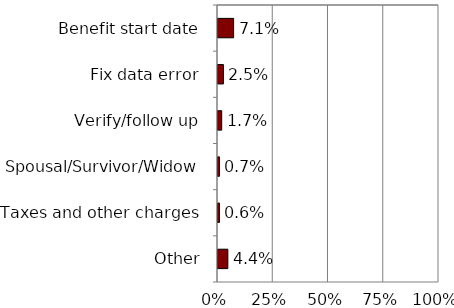
| Category | Series 0 |
|---|---|
| Benefit start date | 0.071 |
| Fix data error | 0.025 |
| Verify/follow up | 0.017 |
| Spousal/Survivor/Widow | 0.007 |
| Taxes and other charges | 0.006 |
| Other | 0.044 |